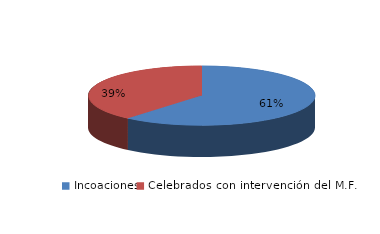
| Category | Series 0 |
|---|---|
| Incoaciones | 3269 |
| Celebrados con intervención del M.F. | 2071 |